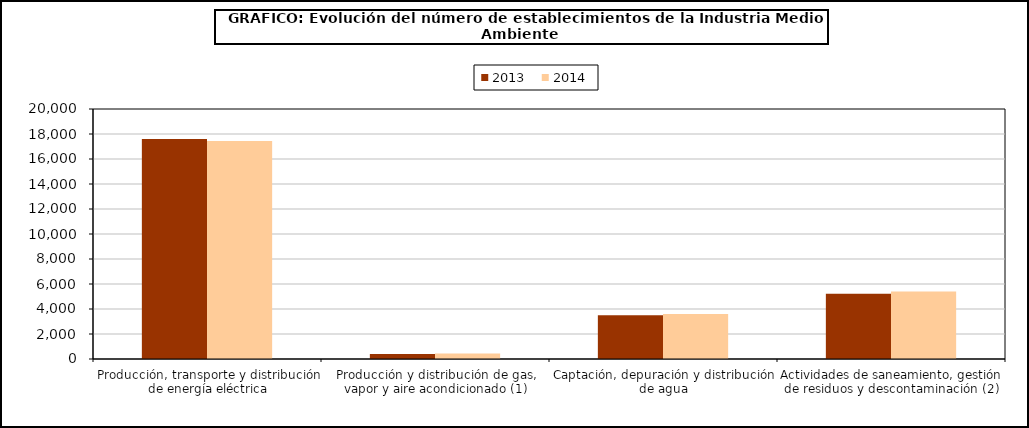
| Category | 2013 | 2014 |
|---|---|---|
| Producción, transporte y distribución de energía eléctrica | 17592 | 17447 |
| Producción y distribución de gas, vapor y aire acondicionado (1) | 405 | 436 |
| Captación, depuración y distribución de agua | 3494 | 3602 |
| Actividades de saneamiento, gestión de residuos y descontaminación (2) | 5215 | 5397 |